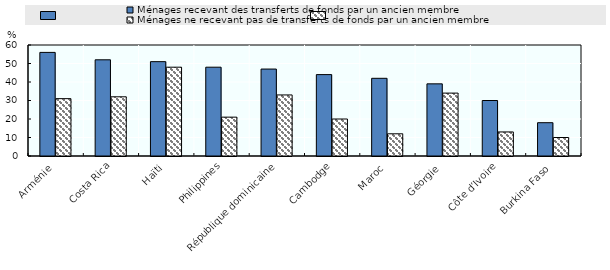
| Category | Ménages recevant des transferts de fonds par un ancien membre | Ménages ne recevant pas de transferts de fonds par un ancien membre |
|---|---|---|
| Arménie | 56 | 31 |
| Costa Rica | 52 | 32 |
| Haïti  | 51 | 48 |
| Philippines | 48 | 21 |
| République dominicaine | 47 | 33 |
| Cambodge | 44 | 20 |
| Maroc | 42 | 12 |
| Géorgie | 39 | 34 |
| Côte d’Ivoire | 30 | 13 |
| Burkina Faso | 18 | 10 |